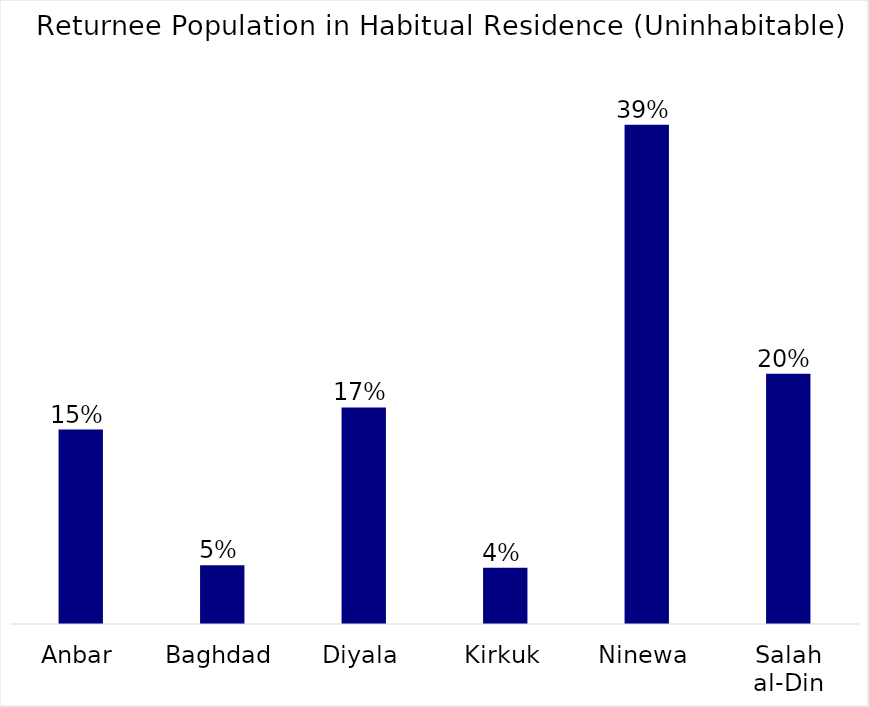
| Category | Series 0 |
|---|---|
| Anbar | 0.152 |
| Baghdad | 0.046 |
| Diyala | 0.17 |
| Kirkuk | 0.044 |
| Ninewa | 0.391 |
| Salah al-Din | 0.196 |